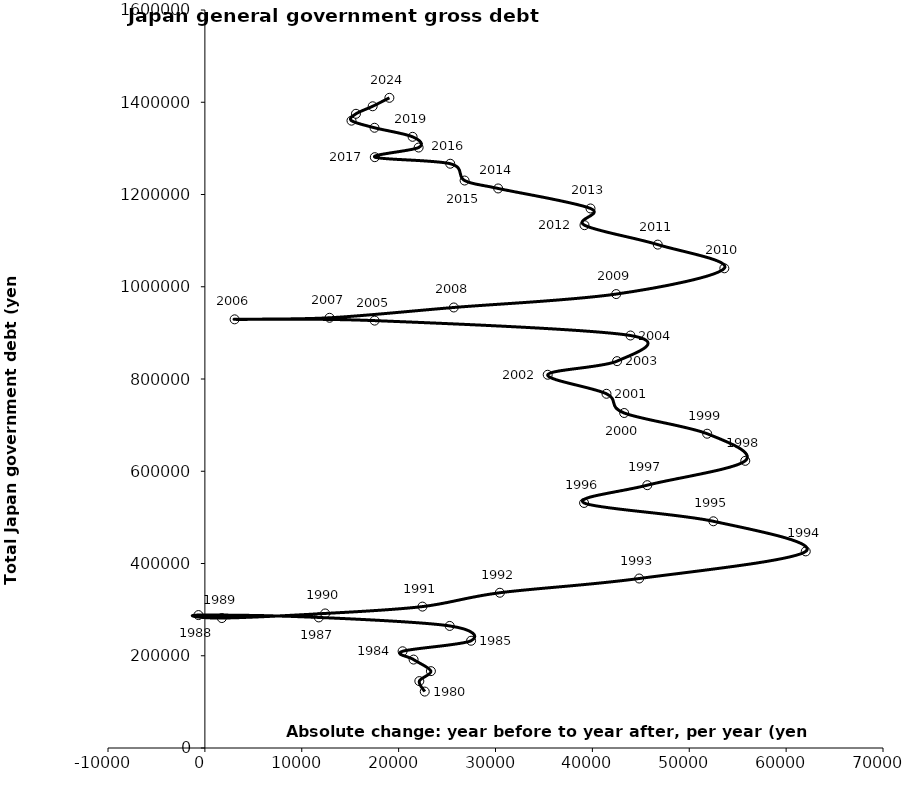
| Category | Series 0 |
|---|---|
| 22696.399999999994 | 122341.9 |
| 22137.699999999997 | 145038.3 |
| 23333.15000000001 | 166617.3 |
| 21543.95000000001 | 191704.6 |
| 20409.449999999997 | 209705.2 |
| 27480.899999999994 | 232523.5 |
| 25271.20000000001 | 264667 |
| 11758.950000000012 | 283065.9 |
| -663.1000000000058 | 288184.9 |
| 1752.1499999999942 | 281739.7 |
| 12414.850000000006 | 291689.2 |
| 22458.600000000006 | 306569.4 |
| 30447.149999999994 | 336606.4 |
| 44831.29999999999 | 367463.7 |
| 62026.04999999999 | 426269 |
| 52488.45000000001 | 491515.8 |
| 39144.55000000002 | 531245.9 |
| 45668.75 | 569804.9 |
| 55782.29999999999 | 622583.4 |
| 51848.149999999965 | 681369.5 |
| 43284.75 | 726279.7 |
| 41455.80000000005 | 767939 |
| 35387.95000000001 | 809191.3 |
| 42548.5 | 838714.9 |
| 43932.649999999965 | 894288.3 |
| 17525.04999999999 | 926580.2 |
| 3070.0500000000466 | 929338.4 |
| 12868.049999999988 | 932720.3 |
| 25694.349999999977 | 955074.5 |
| 42459.45000000001 | 984109 |
| 53622.69999999995 | 1039993.4 |
| 46748.49999999994 | 1091354.4 |
| 39186.70000000007 | 1133490.4 |
| 39805.20000000007 | 1169727.8 |
| 30273.5 | 1213100.8 |
| 26810.349999999977 | 1230274.8 |
| 25326.5 | 1266721.5 |
| 17540.175000000047 | 1280927.8 |
| 22064.69499999995 | 1301801.85 |
| 21442.22999999998 | 1325057.19 |
| 17509.780000000028 | 1344686.31 |
| 15134.944999999949 | 1360076.75 |
| 15595.435000000056 | 1374956.2 |
| 17320.969999999972 | 1391267.62 |
| 19046.50499999989 | 1409598.14 |